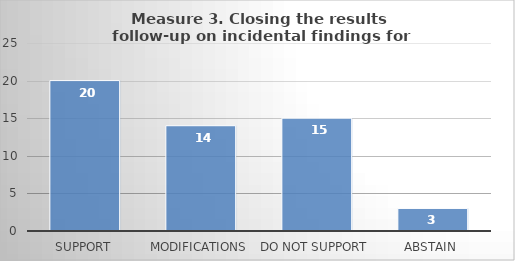
| Category | Series 0 |
|---|---|
| Support | 20 |
| Modifications | 14 |
| Do not support | 15 |
| Abstain | 3 |